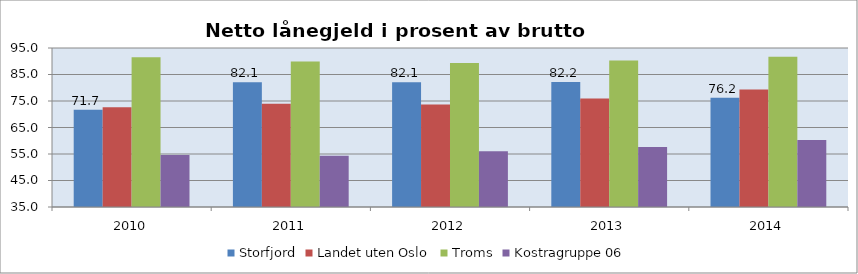
| Category | Storfjord | Landet uten Oslo | Troms | Kostragruppe 06 |
|---|---|---|---|---|
| 2010 | 71.7 | 72.6 | 91.5 | 54.6 |
| 2011 | 82.1 | 74 | 89.9 | 54.3 |
| 2012 | 82.1 | 73.7 | 89.3 | 56 |
| 2013 | 82.2 | 75.9 | 90.3 | 57.6 |
| 2014 | 76.2 | 79.3 | 91.7 | 60.3 |